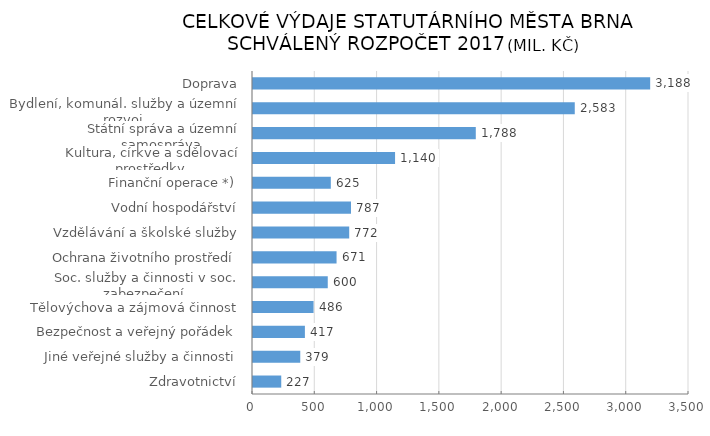
| Category | Series 0 |
|---|---|
|  Zdravotnictví | 226.785 |
|  Jiné veřejné služby a činnosti | 379.392 |
|  Bezpečnost a veřejný pořádek | 416.639 |
|  Tělovýchova a zájmová činnost | 486.044 |
|  Soc. služby a činnosti v soc. zabezpečení | 600.15 |
|  Ochrana životního prostředí | 670.75 |
|  Vzdělávání a školské služby | 772.331 |
|  Vodní hospodářství | 786.581 |
|  Finanční operace *) | 624.652 |
|  Kultura, církve a sdělovací prostředky | 1140.407 |
|  Státní správa a územní samospráva | 1788.431 |
|  Bydlení, komunál. služby a územní rozvoj | 2582.996 |
|  Doprava | 3188.346 |